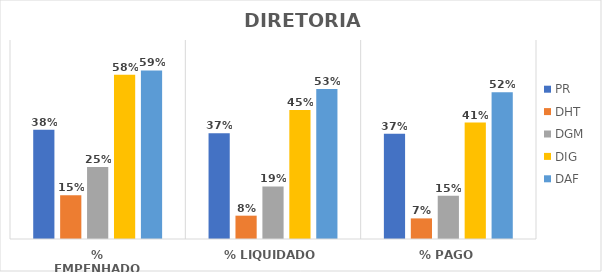
| Category | PR | DHT | DGM | DIG | DAF |
|---|---|---|---|---|---|
| % EMPENHADO | 0.384 | 0.154 | 0.253 | 0.578 | 0.593 |
| % LIQUIDADO | 0.372 | 0.082 | 0.185 | 0.454 | 0.528 |
| % PAGO | 0.37 | 0.072 | 0.152 | 0.41 | 0.517 |